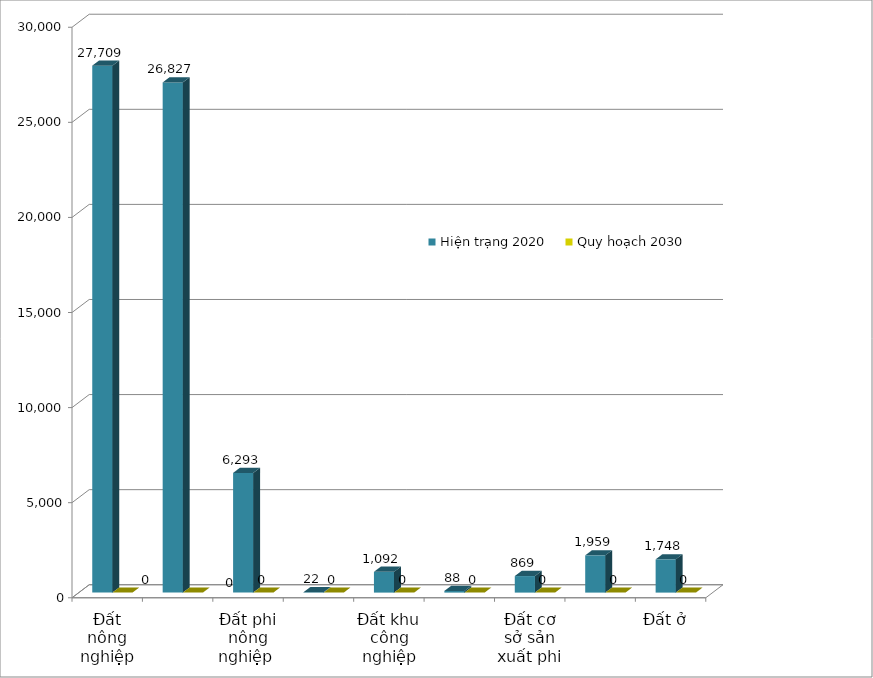
| Category | Hiện trạng 2020 | Quy hoạch 2030 |
|---|---|---|
| Đất nông nghiệp | 27708.773 | 0 |
| Đất trồng cây lâu năm  | 26827.302 | 0 |
| Đất phi nông nghiệp  | 6293.337 | 0 |
| Đất quốc phòng | 22.035 | 0 |
| Đất khu công nghiệp | 1092.424 | 0 |
| Đất thương mại dịch vụ | 87.788 | 0 |
| Đất cơ sở sản xuất phi nông nghiệp | 869.385 | 0 |
| Đất phát triển hạ tầng | 1958.842 | 0 |
| Đất ở  | 1748.173 | 0 |